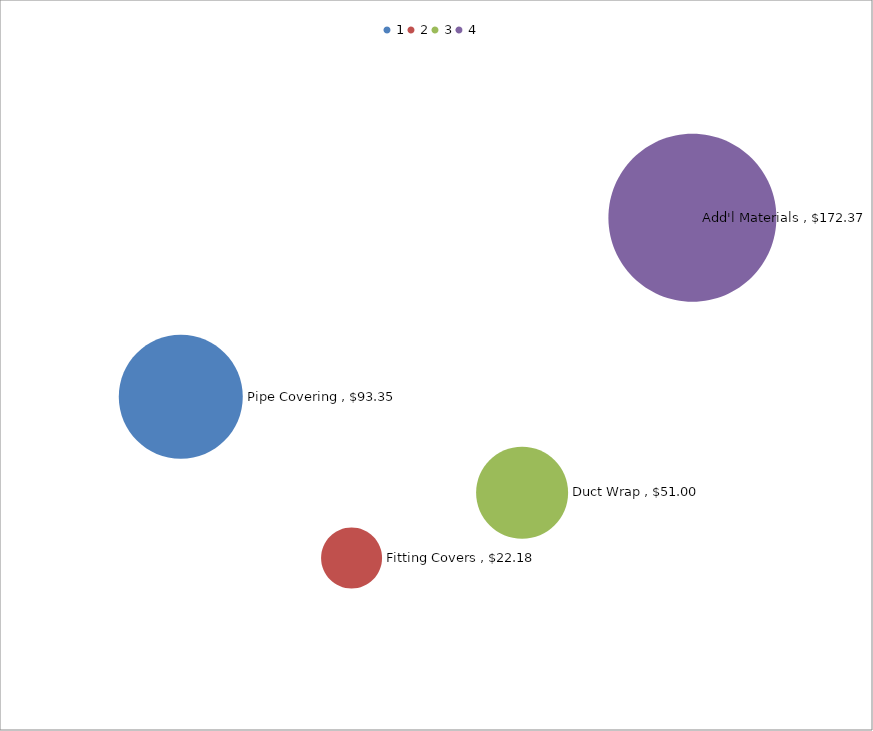
| Category | Material & Labor Analysis (as a % of total Materials) |
|---|---|
| 0 | 93.346 |
| 1 | 22.176 |
| 2 | 51 |
| 3 | 172.368 |